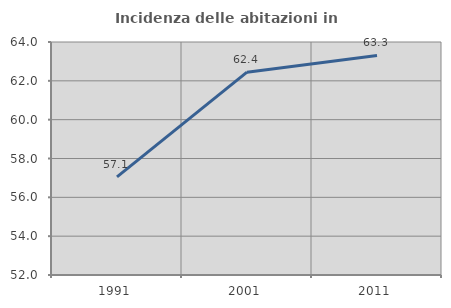
| Category | Incidenza delle abitazioni in proprietà  |
|---|---|
| 1991.0 | 57.051 |
| 2001.0 | 62.445 |
| 2011.0 | 63.308 |